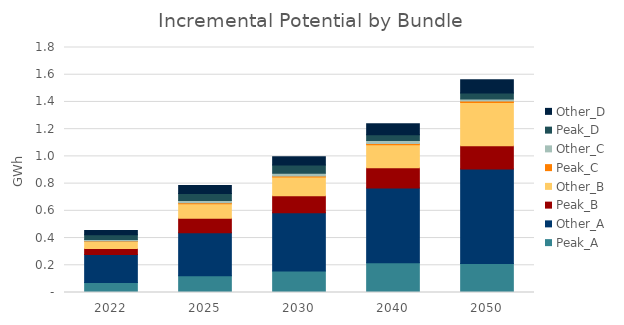
| Category | Peak_A | Other_A | Peak_B | Other_B | Peak_C | Other_C | Peak_D | Other_D |
|---|---|---|---|---|---|---|---|---|
| 2022.0 | 0.074 | 0.204 | 0.045 | 0.051 | 0.003 | 0.013 | 0.035 | 0.032 |
| 2025.0 | 0.123 | 0.315 | 0.108 | 0.106 | 0.007 | 0.017 | 0.051 | 0.059 |
| 2030.0 | 0.157 | 0.429 | 0.124 | 0.138 | 0.007 | 0.02 | 0.06 | 0.061 |
| 2040.0 | 0.219 | 0.549 | 0.15 | 0.169 | 0.009 | 0.021 | 0.043 | 0.082 |
| 2050.0 | 0.213 | 0.694 | 0.172 | 0.318 | 0.01 | 0.016 | 0.043 | 0.097 |